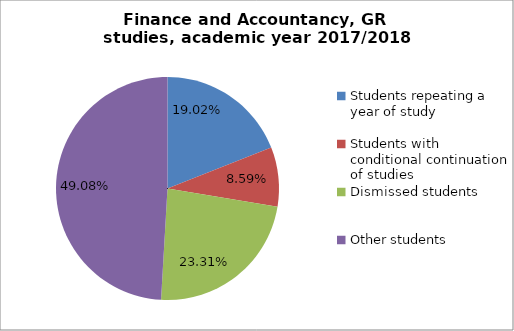
| Category | Series 0 |
|---|---|
| Students repeating a year of study | 31 |
| Students with conditional continuation of studies | 14 |
| Dismissed students | 38 |
| Other students | 80 |